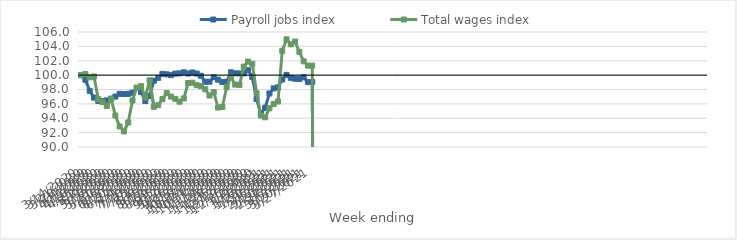
| Category | Payroll jobs index | Total wages index |
|---|---|---|
| 14/03/2020 | 100 | 100 |
| 21/03/2020 | 99.357 | 100.154 |
| 28/03/2020 | 97.815 | 99.692 |
| 04/04/2020 | 96.866 | 99.814 |
| 11/04/2020 | 96.41 | 96.66 |
| 18/04/2020 | 96.383 | 96.244 |
| 25/04/2020 | 96.481 | 95.715 |
| 02/05/2020 | 96.728 | 96.667 |
| 09/05/2020 | 97.015 | 94.384 |
| 16/05/2020 | 97.394 | 92.856 |
| 23/05/2020 | 97.379 | 92.174 |
| 30/05/2020 | 97.404 | 93.405 |
| 06/06/2020 | 97.553 | 96.48 |
| 13/06/2020 | 98.22 | 98.265 |
| 20/06/2020 | 97.655 | 98.46 |
| 27/06/2020 | 96.392 | 96.9 |
| 04/07/2020 | 97.107 | 99.276 |
| 11/07/2020 | 99.234 | 95.597 |
| 18/07/2020 | 99.618 | 95.816 |
| 25/07/2020 | 100.179 | 96.667 |
| 01/08/2020 | 100.107 | 97.506 |
| 08/08/2020 | 99.996 | 97.017 |
| 15/08/2020 | 100.209 | 96.702 |
| 22/08/2020 | 100.246 | 96.301 |
| 29/08/2020 | 100.39 | 96.756 |
| 05/09/2020 | 100.227 | 98.906 |
| 12/09/2020 | 100.369 | 98.947 |
| 19/09/2020 | 100.22 | 98.605 |
| 26/09/2020 | 99.912 | 98.47 |
| 03/10/2020 | 99.082 | 98.031 |
| 10/10/2020 | 99.091 | 97.159 |
| 17/10/2020 | 99.699 | 97.625 |
| 24/10/2020 | 99.366 | 95.489 |
| 31/10/2020 | 99.041 | 95.567 |
| 07/11/2020 | 99.064 | 98.323 |
| 14/11/2020 | 100.393 | 99.744 |
| 21/11/2020 | 100.252 | 98.681 |
| 28/11/2020 | 100.245 | 98.642 |
| 05/12/2020 | 100.252 | 101.176 |
| 12/12/2020 | 100.685 | 101.887 |
| 19/12/2020 | 99.744 | 101.57 |
| 26/12/2020 | 96.676 | 97.476 |
| 02/01/2021 | 94.615 | 94.373 |
| 09/01/2021 | 95.457 | 94.129 |
| 16/01/2021 | 97.446 | 95.382 |
| 23/01/2021 | 98.158 | 95.989 |
| 30/01/2021 | 98.298 | 96.326 |
| 06/02/2021 | 99.39 | 103.381 |
| 13/02/2021 | 100.031 | 104.975 |
| 20/02/2021 | 99.626 | 104.285 |
| 27/02/2021 | 99.489 | 104.669 |
| 06/03/2021 | 99.449 | 103.235 |
| 13/03/2021 | 99.694 | 101.922 |
| 20/03/2021 | 99.037 | 101.323 |
| 27/03/2021 | 99.037 | 101.323 |